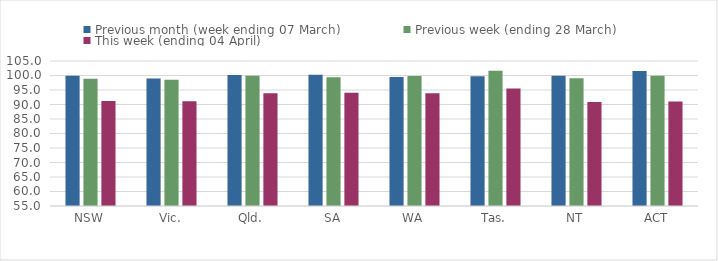
| Category | Previous month (week ending 07 March) | Previous week (ending 28 March) | This week (ending 04 April) |
|---|---|---|---|
| NSW | 99.925 | 98.901 | 91.235 |
| Vic. | 98.958 | 98.518 | 91.088 |
| Qld. | 100.163 | 99.918 | 93.883 |
| SA | 100.256 | 99.432 | 94.066 |
| WA | 99.499 | 99.839 | 93.847 |
| Tas. | 99.749 | 101.662 | 95.478 |
| NT | 99.894 | 99.05 | 90.887 |
| ACT | 101.595 | 99.899 | 91.077 |